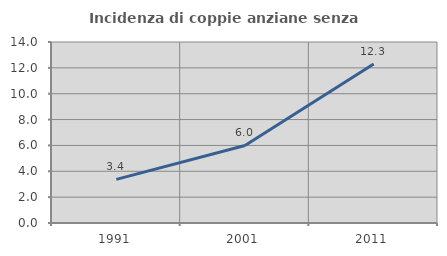
| Category | Incidenza di coppie anziane senza figli  |
|---|---|
| 1991.0 | 3.376 |
| 2001.0 | 5.997 |
| 2011.0 | 12.3 |